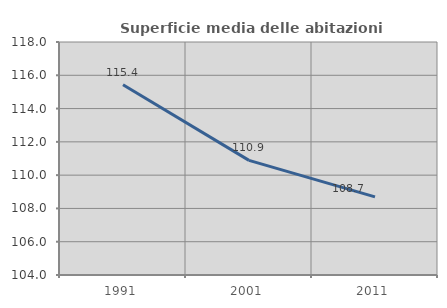
| Category | Superficie media delle abitazioni occupate |
|---|---|
| 1991.0 | 115.435 |
| 2001.0 | 110.886 |
| 2011.0 | 108.694 |